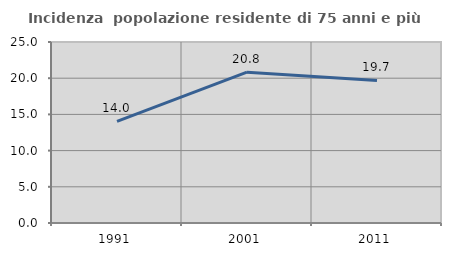
| Category | Incidenza  popolazione residente di 75 anni e più |
|---|---|
| 1991.0 | 14.033 |
| 2001.0 | 20.828 |
| 2011.0 | 19.692 |